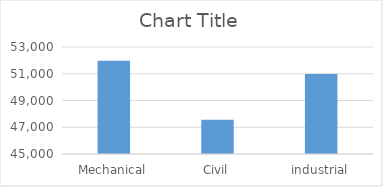
| Category | Series 0 |
|---|---|
| Mechanical | 51980 |
| Civil | 47560 |
| industrial | 50980 |